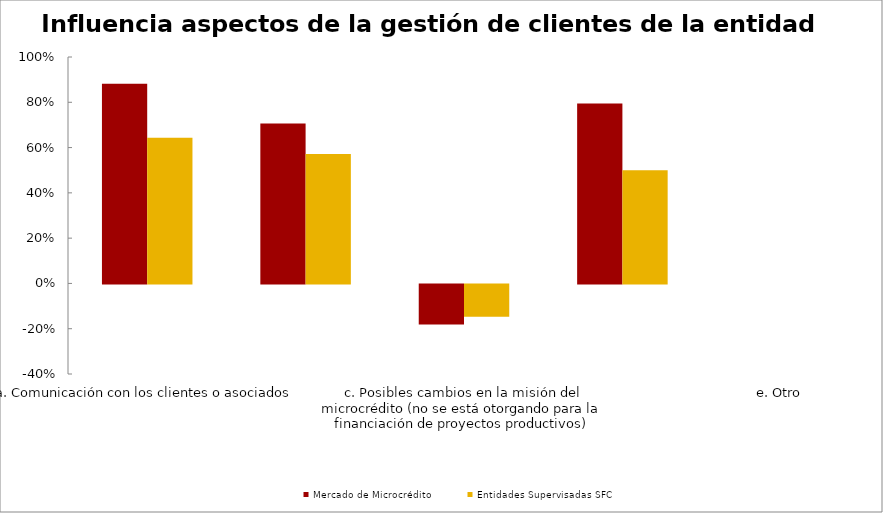
| Category | Mercado de Microcrédito | Entidades Supervisadas SFC |
|---|---|---|
| a. Comunicación con los clientes o asociados | 0.882 | 0.643 |
| b. Desarrollo de productos adecuados para los clientes o asociados | 0.706 | 0.571 |
| c. Posibles cambios en la misión del microcrédito (no se está otorgando para la financiación de proyectos productivos) | -0.176 | -0.143 |
| d. Apoyo del asesor de microcrédito | 0.794 | 0.5 |
| e. Otro | 0 | 0 |